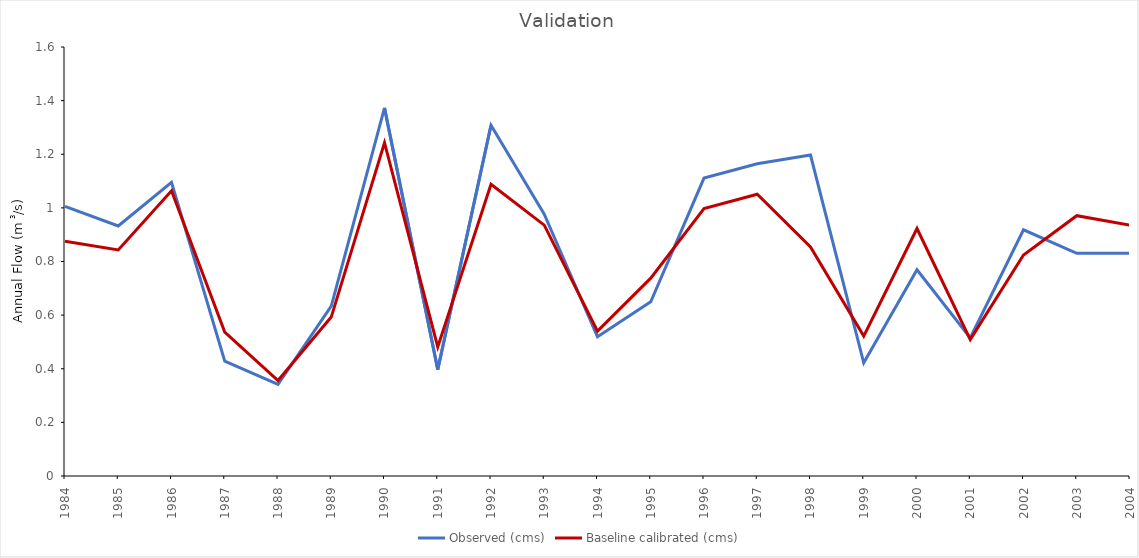
| Category | Observed (cms) | Baseline calibrated (cms) |
|---|---|---|
| 1984.0 | 1.006 | 0.876 |
| 1985.0 | 0.932 | 0.843 |
| 1986.0 | 1.095 | 1.064 |
| 1987.0 | 0.428 | 0.537 |
| 1988.0 | 0.342 | 0.356 |
| 1989.0 | 0.633 | 0.593 |
| 1990.0 | 1.373 | 1.243 |
| 1991.0 | 0.397 | 0.481 |
| 1992.0 | 1.308 | 1.088 |
| 1993.0 | 0.977 | 0.936 |
| 1994.0 | 0.519 | 0.54 |
| 1995.0 | 0.65 | 0.738 |
| 1996.0 | 1.111 | 0.997 |
| 1997.0 | 1.165 | 1.051 |
| 1998.0 | 1.197 | 0.854 |
| 1999.0 | 0.422 | 0.522 |
| 2000.0 | 0.769 | 0.923 |
| 2001.0 | 0.515 | 0.509 |
| 2002.0 | 0.918 | 0.824 |
| 2003.0 | 0.83 | 0.971 |
| 2004.0 | 0.83 | 0.935 |